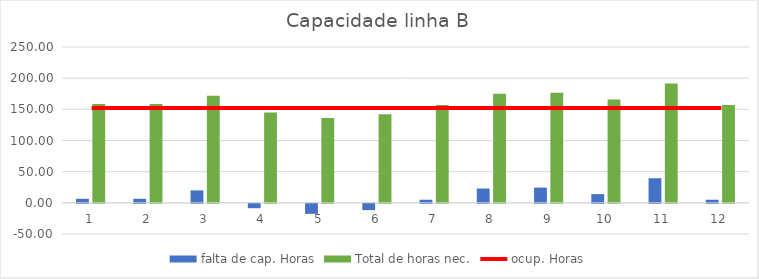
| Category | falta de cap. Horas | Total de horas nec. |
|---|---|---|
| 1.0 | 6.45 | 158.45 |
| 2.0 | 6.45 | 158.45 |
| 3.0 | 19.95 | 171.95 |
| 4.0 | -7.05 | 144.95 |
| 5.0 | -16.05 | 135.95 |
| 6.0 | -10.05 | 141.95 |
| 7.0 | 4.95 | 156.95 |
| 8.0 | 22.95 | 174.95 |
| 9.0 | 24.45 | 176.45 |
| 10.0 | 13.95 | 165.95 |
| 11.0 | 39.45 | 191.45 |
| 12.0 | 4.95 | 156.95 |